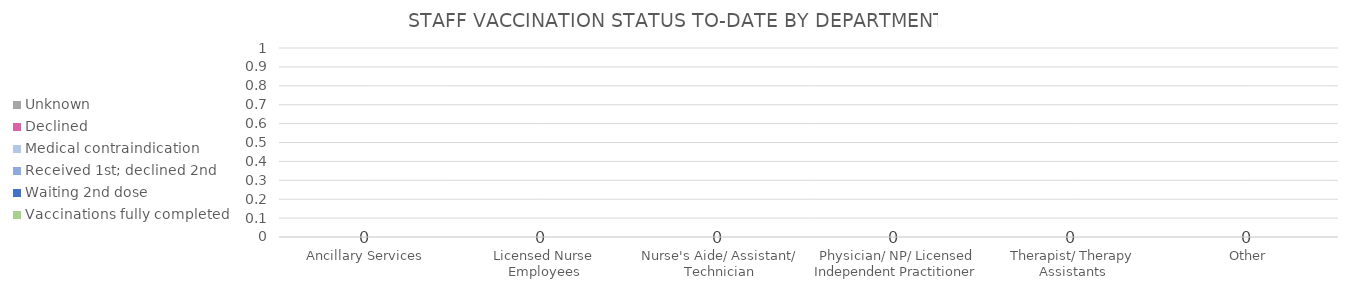
| Category | Vaccinations fully completed | Waiting 2nd dose | Received 1st; declined 2nd | Medical contraindication | Declined | Unknown |
|---|---|---|---|---|---|---|
| Ancillary Services | 0 | 0 | 0 | 0 | 0 | 0 |
| Licensed Nurse Employees | 0 | 0 | 0 | 0 | 0 | 0 |
| Nurse's Aide/ Assistant/ Technician | 0 | 0 | 0 | 0 | 0 | 0 |
| Physician/ NP/ Licensed Independent Practitioner | 0 | 0 | 0 | 0 | 0 | 0 |
| Therapist/ Therapy Assistants | 0 | 0 | 0 | 0 | 0 | 0 |
| Other | 0 | 0 | 0 | 0 | 0 | 0 |